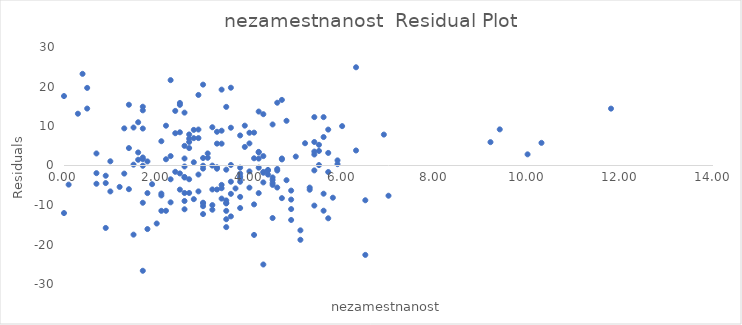
| Category | Series 0 |
|---|---|
| 5.5 | 3.69 |
| 3.3 | -0.812 |
| 4.0 | 8.292 |
| 0.7 | 3.049 |
| 1.4 | 15.382 |
| 10.0 | 2.826 |
| 4.5 | -4.449 |
| 3.4 | 5.53 |
| 2.6 | 4.965 |
| 5.4 | -1.242 |
| 5.2 | 5.634 |
| 0.5 | 19.645 |
| 2.7 | 5.957 |
| 3.9 | 10.09 |
| 1.3 | -2.05 |
| 1.3 | 9.4 |
| 2.1 | 6.145 |
| 2.9 | 9.101 |
| 2.9 | 6.941 |
| 2.4 | 13.821 |
| 3.5 | -15.598 |
| 2.5 | 15.833 |
| 2.6 | 13.385 |
| 5.9 | 0.338 |
| 3.3 | 8.538 |
| 1.7 | 14.878 |
| 0.5 | 14.415 |
| 3.2 | -0.024 |
| 1.5 | 9.614 |
| 4.3 | 12.987 |
| 2.1 | -7.585 |
| 0.4 | 23.203 |
| 3.0 | -9.418 |
| 4.0 | 5.592 |
| 1.4 | 4.412 |
| 5.6 | -11.448 |
| 2.3 | 21.609 |
| 2.7 | 4.417 |
| 5.7 | 9.094 |
| 4.5 | -3.689 |
| 4.6 | -5.577 |
| 1.7 | 1.608 |
| 1.6 | 10.946 |
| 2.8 | 6.919 |
| 2.7 | 7.857 |
| 2.3 | -9.331 |
| 2.5 | -2.007 |
| 9.4 | 9.144 |
| 10.3 | 5.731 |
| 0.0 | 17.575 |
| 1.6 | 3.306 |
| 2.2 | 10.077 |
| 4.2 | 13.655 |
| 1.7 | 2.028 |
| 1.7 | 13.968 |
| 3.6 | 9.564 |
| 11.8 | 14.4 |
| 1.8 | -16.09 |
| 1.7 | -26.652 |
| 5.4 | -10.152 |
| 5.9 | 1.298 |
| 2.2 | 1.577 |
| 0.9 | -4.447 |
| 3.4 | -4.91 |
| 3.0 | -12.298 |
| 0.1 | -4.843 |
| 4.5 | 10.391 |
| 4.2 | 3.445 |
| 4.7 | -8.265 |
| 3.5 | -9.588 |
| 4.9 | -13.791 |
| 2.6 | 1.775 |
| 3.6 | -7.176 |
| 2.6 | -6.955 |
| 2.1 | -11.475 |
| 2.3 | -3.491 |
| 2.6 | -2.905 |
| 2.6 | -3.035 |
| 3.0 | 1.892 |
| 2.1 | -7.105 |
| 3.4 | -5.75 |
| 2.2 | -11.463 |
| 2.5 | -6.107 |
| 1.7 | -0.062 |
| 4.3 | -4.283 |
| 5.5 | 5.24 |
| 4.3 | 2.377 |
| 2.5 | 15.353 |
| 1.8 | -6.99 |
| 2.3 | 2.379 |
| 3.8 | -2.782 |
| 4.6 | -0.877 |
| 2.5 | 8.403 |
| 2.4 | 8.171 |
| 9.2 | 5.91 |
| 2.9 | -2.289 |
| 6.3 | 24.865 |
| 4.3 | -1.623 |
| 1.9 | -4.728 |
| 2.7 | 6.797 |
| 4.2 | 1.755 |
| 4.8 | 11.317 |
| 3.0 | -0.058 |
| 4.7 | 16.605 |
| 5.0 | 2.261 |
| 2.9 | 17.861 |
| 4.2 | -0.545 |
| 5.6 | 7.202 |
| 4.7 | 1.775 |
| 2.8 | 0.819 |
| 3.8 | 7.608 |
| 3.2 | 9.686 |
| 4.2 | 3.315 |
| 3.0 | 20.472 |
| 4.9 | -6.351 |
| 3.3 | -6.082 |
| 6.0 | 9.97 |
| 3.4 | 8.81 |
| 3.6 | 19.694 |
| 2.6 | -8.985 |
| 4.6 | -1.277 |
| 4.6 | 15.893 |
| 5.5 | 0.11 |
| 0.7 | -4.621 |
| 4.2 | -6.995 |
| 3.7 | -5.804 |
| 6.3 | 3.805 |
| 6.9 | 7.827 |
| 3.6 | -4.106 |
| 3.8 | -0.542 |
| 1.0 | 1.064 |
| 1.2 | -5.422 |
| 5.6 | 12.242 |
| 5.8 | -8.154 |
| 0.3 | 13.111 |
| 0.0 | -12.045 |
| 5.4 | 5.948 |
| 4.7 | 1.535 |
| 1.0 | -6.566 |
| 2.7 | -6.953 |
| 3.0 | -9.578 |
| 2.4 | -1.599 |
| 0.9 | -2.587 |
| 1.5 | -17.506 |
| 3.2 | -11.194 |
| 3.4 | 19.21 |
| 2.6 | -0.245 |
| 5.4 | 3.528 |
| 5.7 | -1.656 |
| 2.0 | -14.687 |
| 1.8 | 1.03 |
| 5.1 | -18.808 |
| 4.5 | -3.019 |
| 4.0 | -1.498 |
| 0.7 | -1.941 |
| 3.2 | -6.064 |
| 4.1 | -9.847 |
| 3.8 | -3.212 |
| 3.6 | -12.886 |
| 6.5 | -8.801 |
| 0.9 | -15.807 |
| 5.4 | 12.248 |
| 3.9 | 4.7 |
| 3.5 | -13.598 |
| 3.8 | -4.112 |
| 5.3 | -6.134 |
| 2.8 | 9.019 |
| 6.5 | -22.631 |
| 3.8 | -7.952 |
| 1.5 | 0.214 |
| 3.5 | -1.058 |
| 4.4 | -1.291 |
| 3.3 | -0.452 |
| 4.1 | 1.823 |
| 5.7 | 3.184 |
| 3.8 | -2.062 |
| 4.9 | -8.631 |
| 3.5 | -8.848 |
| 5.3 | -5.594 |
| 3.5 | -11.488 |
| 3.4 | -8.38 |
| 2.8 | -8.521 |
| 4.8 | -3.723 |
| 2.9 | -6.559 |
| 4.9 | -11.031 |
| 2.7 | -3.483 |
| 4.1 | -17.577 |
| 5.1 | -16.418 |
| 5.4 | 2.788 |
| 1.7 | -9.432 |
| 3.5 | 14.842 |
| 3.2 | -10.024 |
| 1.6 | 1.456 |
| 4.5 | -13.299 |
| 5.7 | -13.366 |
| 4.4 | -2.301 |
| 3.8 | -10.772 |
| 1.4 | -5.998 |
| 4.4 | -1.121 |
| 4.1 | 8.323 |
| 3.1 | 1.954 |
| 2.6 | -11.085 |
| 1.7 | 9.358 |
| 3.0 | -10.298 |
| 3.1 | 3.054 |
| 7.0 | -7.651 |
| 3.5 | -9.488 |
| 3.3 | 5.538 |
| 5.6 | -7.138 |
| 4.3 | -25.063 |
| 4.3 | -1.833 |
| 4.0 | -5.608 |
| 4.5 | -4.909 |
| 3.6 | 0.134 |
| 3.0 | -0.788 |